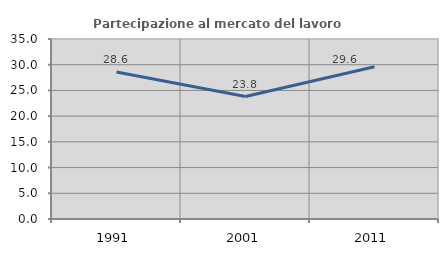
| Category | Partecipazione al mercato del lavoro  femminile |
|---|---|
| 1991.0 | 28.587 |
| 2001.0 | 23.816 |
| 2011.0 | 29.619 |